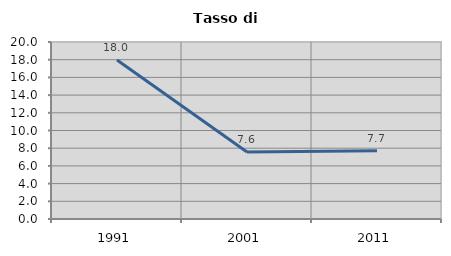
| Category | Tasso di disoccupazione   |
|---|---|
| 1991.0 | 17.969 |
| 2001.0 | 7.563 |
| 2011.0 | 7.711 |